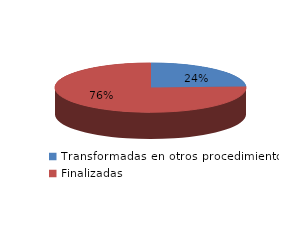
| Category | Series 0 |
|---|---|
| Transformadas en otros procedimientos | 3604 |
| Finalizadas | 11242 |